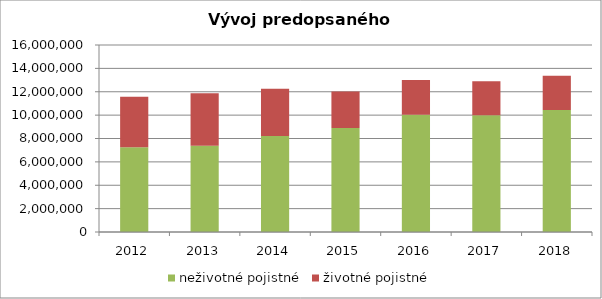
| Category | neživotné pojistné | životné pojistné |
|---|---|---|
| 2012.0 | 7261003 | 4307296 |
| 2013.0 | 7390179 | 4480934 |
| 2014.0 | 8210781 | 4036280 |
| 2015.0 | 8906152 | 3124482 |
| 2016.0 | 10035155 | 2968250 |
| 2017.0 | 9985541 | 2904927 |
| 2018.0 | 10440130 | 2934615 |